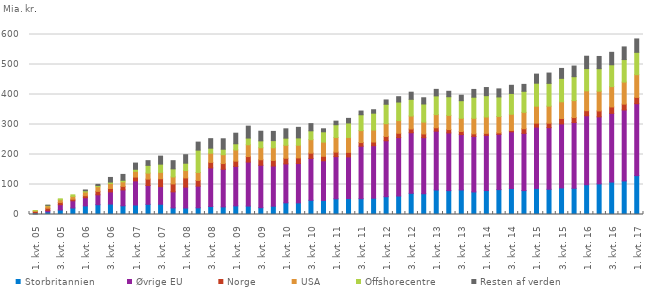
| Category | Storbritannien | Øvrige EU | Norge | USA | Offshorecentre | Resten af verden |
|---|---|---|---|---|---|---|
| 1. kvt. 05 | 5.1 | -1.9 | 5.4 | 1.9 | 0.6 | -0.3 |
| 2. kvt. 05 | 8.7 | 4.9 | 7.3 | 7.8 | 1.8 | 0.6 |
| 3. kvt. 05 | 15.1 | 17.5 | 7.6 | 9 | 3 | -0.3 |
| 4. kvt. 05 | 21.8 | 23.9 | 5.3 | 9.5 | 5 | -0.5 |
| 1. kvt. 06 | 28.7 | 27.2 | 6.8 | 12.2 | 4.3 | 2.6 |
| 2. kvt. 06 | 32.6 | 33 | 11.5 | 15.6 | 3.8 | 4 |
| 3. kvt. 06 | 34.8 | 40.6 | 11.2 | 16.7 | 4.8 | 15.4 |
| 4. kvt. 06 | 29 | 53 | 11.8 | 15 | 5.3 | 19.5 |
| 1. kvt. 07 | 31.6 | 80.5 | 12.7 | 19.1 | 6.8 | 20.7 |
| 2. kvt. 07 | 33.9 | 62.8 | 21.3 | 20.1 | 25.7 | 15.7 |
| 3. kvt. 07 | 34.2 | 58.7 | 26.2 | 21.3 | 27.5 | 26.7 |
| 4. kvt. 07 | 22.1 | 53.4 | 26.4 | 23.3 | 27 | 27.2 |
| 1. kvt. 08 | 21.6 | 69.6 | 30.7 | 24.8 | 24.3 | 28.3 |
| 2. kvt. 08 | 22.3 | 72.3 | 18.9 | 26.7 | 74.4 | 26.7 |
| 3. kvt. 08 | 26.7 | 128.6 | 18.4 | 30.6 | 16.8 | 31.7 |
| 4. kvt. 08 | 25.3 | 125.5 | 19 | 29.6 | 18.2 | 34.8 |
| 1. kvt. 09 | 28.8 | 131.6 | 17.4 | 37.4 | 20.6 | 35.2 |
| 2. kvt. 09 | 28.1 | 146.7 | 18.4 | 39.2 | 22.4 | 39.7 |
| 3. kvt. 09 | 22.6 | 141.5 | 18.4 | 40 | 23 | 32.1 |
| 4. kvt. 09 | 27.7 | 133.8 | 18.7 | 42.2 | 23.9 | 30.7 |
| 1. kvt. 10 | 38.9 | 129.8 | 18.8 | 43.3 | 23.7 | 31.1 |
| 2. kvt. 10 | 38.7 | 131.4 | 18.6 | 42.2 | 24.4 | 35.2 |
| 3. kvt. 10 | 47.4 | 139.6 | 17.5 | 45 | 29.5 | 23.9 |
| 4. kvt. 10 | 46.9 | 132.2 | 14.9 | 47.3 | 34.4 | 10 |
| 1. kvt. 11 | 52.4 | 140.5 | 15 | 48.9 | 42.5 | 11.9 |
| 2. kvt. 11 | 53.2 | 138.9 | 15 | 49.7 | 48.4 | 15.2 |
| 3. kvt. 11 | 52.6 | 175.1 | 12.1 | 39.9 | 52.8 | 12.4 |
| 4. kvt. 11 | 54.4 | 174.8 | 12.4 | 40 | 56.2 | 11.4 |
| 1. kvt. 12 | 59.3 | 186.5 | 14.4 | 42.6 | 64.7 | 14.3 |
| 2. kvt. 12 | 61.6 | 194.7 | 14.5 | 42.3 | 61.8 | 17.8 |
| 3. kvt. 12 | 70.6 | 201.9 | 12.5 | 43.3 | 55.6 | 23.8 |
| 4. kvt. 12 | 69.2 | 186.9 | 12.4 | 39.5 | 60.4 | 20.7 |
| 1. kvt. 13 | 81.7 | 196.1 | 11.3 | 43.9 | 62.4 | 21.7 |
| 2. kvt. 13 | 79.6 | 192.3 | 11.2 | 47.3 | 62.2 | 18.1 |
| 3. kvt. 13 | 81.8 | 184.6 | 10.3 | 43.9 | 58.8 | 18.3 |
| 4. kvt. 13 | 75.2 | 185.1 | 8.5 | 51.9 | 70.3 | 25.9 |
| 1. kvt. 14 | 79.8 | 183.9 | 6.8 | 54.5 | 71.1 | 27.1 |
| 2. kvt. 14 | 83 | 184.2 | 5 | 54.6 | 65.1 | 26.8 |
| 3. kvt. 14 | 86.5 | 189.1 | 4.3 | 54.2 | 69.4 | 27.2 |
| 4. kvt. 14 | 79.7 | 190.8 | 15.3 | 54.8 | 70.1 | 23 |
| 1. kvt. 15 | 87 | 204.4 | 13.3 | 56.4 | 76.6 | 30.3 |
| 2. kvt. 15 | 84.1 | 205.5 | 14.9 | 56.7 | 75.9 | 34.4 |
| 3. kvt. 15 | 88.5 | 213.5 | 18 | 55.7 | 78.1 | 33.1 |
| 4. kvt. 15 | 87.4 | 219.2 | 16.6 | 56.5 | 79.7 | 35.4 |
| 1. kvt. 16 | 99.2 | 229.9 | 16.9 | 66.3 | 74.1 | 41.2 |
| 2. kvt. 16 | 102.1 | 223.4 | 19.7 | 66 | 74.9 | 40.7 |
| 3. kvt. 16 | 108.2 | 229 | 21.3 | 67.9 | 72.7 | 41.5 |
| 4. kvt. 16 | 111.9 | 236.5 | 19.5 | 73.5 | 75.1 | 42.1 |
| 1. kvt. 17 | 129.6 | 239.7 | 21 | 75.8 | 74.5 | 44.6 |